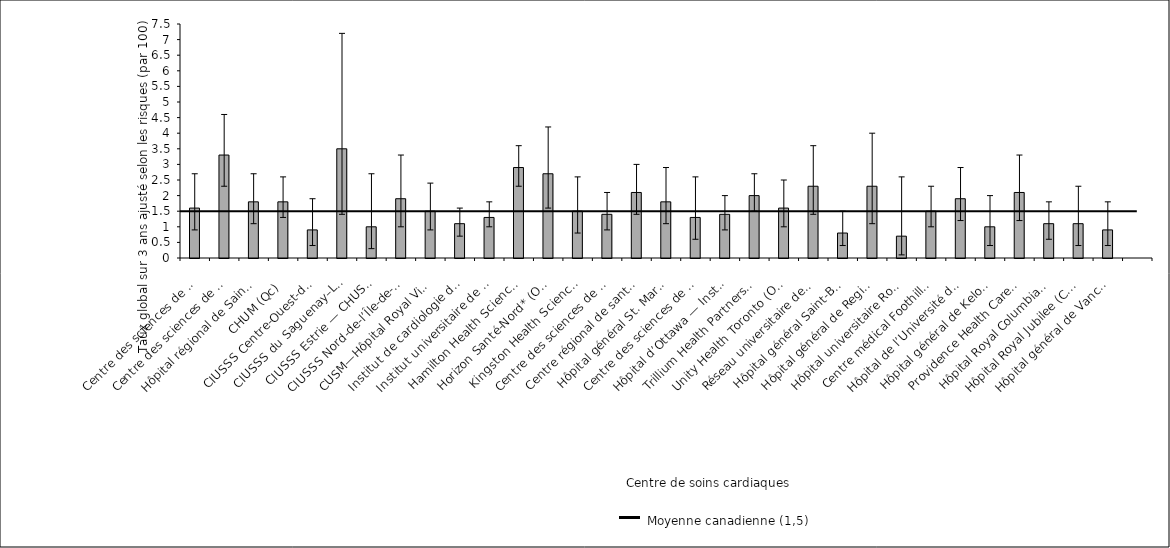
| Category | Taux ajusté selon 
les risques |
|---|---|
| Centre des sciences de la santé — St. John’s (T. -N.-L.) | 1.6 |
| Centre des sciences de la santé Queen Elizabeth II* (N.-É.) | 3.3 |
| Hôpital régional de Saint John (N.-B.) | 1.8 |
| CHUM (Qc) | 1.8 |
| CIUSSS Centre-Ouest-de-l’Île-de-Mtl—Hôpital général juif (Qc) | 0.9 |
| CIUSSS du Saguenay–Lac-St-Jean—Hôpital de Chicoutimi (Qc) | 3.5 |
| CIUSSS Estrie — CHUS—Hôpital Fleurimont (Qc) | 1 |
| CIUSSS Nord-de-l’Île-de-Montréal—Hôpital du Sacré-Cœur de Montréal (Qc) | 1.9 |
| CUSM—Hôpital Royal Victoria (Qc) | 1.5 |
| Institut de cardiologie de Montréal (Qc) | 1.1 |
| Institut universitaire de cardiologie et pneumologie de Québec (Qc) | 1.3 |
| Hamilton Health Sciences* (Ont.) | 2.9 |
| Horizon Santé-Nord* (Ont.) | 2.7 |
| Kingston Health Sciences Centre (Ont.) | 1.5 |
| Centre des sciences de la santé de London (Ont.) | 1.4 |
| Centre régional de santé Southlake (Ont.) | 2.1 |
| Hôpital général St. Mary’s (Ont.) | 1.8 |
| Centre des sciences de la santé Sunnybrook (Ont.) | 1.3 |
| Hôpital d’Ottawa — Institut de cardiologie de l’Université d’Ottawa (Ont.) | 1.4 |
| Trillium Health Partners (Ont.) | 2 |
| Unity Health Toronto (Ont.) | 1.6 |
| Réseau universitaire de santé (Ont.) | 2.3 |
| Hôpital général Saint-Boniface (Man.) | 0.8 |
| Hôpital général de Regina (Sask.) | 2.3 |
| Hôpital universitaire Royal (Sask.) | 0.7 |
| Centre médical Foothills (Alb.) | 1.5 |
| Hôpital de l’Université de l’Alberta (Alb.) | 1.9 |
| Hôpital général de Kelowna (C.-B.) | 1 |
| Providence Health Care — Hôpital St. Paul’s (Vancouver) (C.-B.) | 2.1 |
| Hôpital Royal Columbian (C.-B.) | 1.1 |
| Hôpital Royal Jubilee (C.-B.) | 1.1 |
| Hôpital général de Vancouver (C.-B.) | 0.9 |